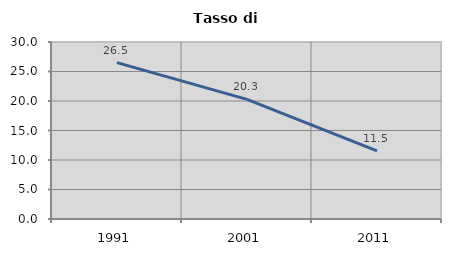
| Category | Tasso di disoccupazione   |
|---|---|
| 1991.0 | 26.508 |
| 2001.0 | 20.268 |
| 2011.0 | 11.542 |